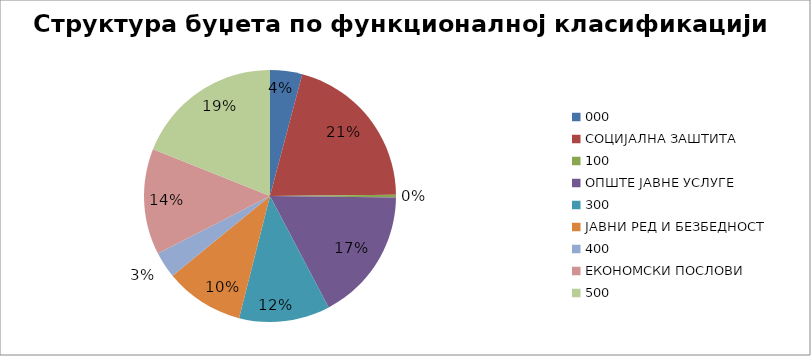
| Category | Series 0 |
|---|---|
| 0 | 37960000 |
| 1 | 190884000 |
| 2 | 3100000 |
| 3 | 157550000 |
| 4 | 107400000 |
| 5 | 93240000 |
| 6 | 31100000 |
| 7 | 125246000 |
| 8 | 174520000 |